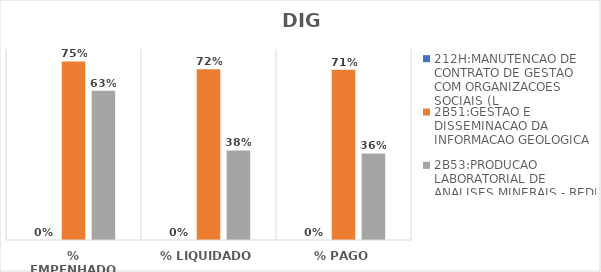
| Category | 212H:MANUTENCAO DE CONTRATO DE GESTAO COM ORGANIZACOES SOCIAIS (L | 2B51:GESTAO E DISSEMINACAO DA INFORMACAO GEOLOGICA | 2B53:PRODUCAO LABORATORIAL DE ANALISES MINERAIS - REDE LAMIN |
|---|---|---|---|
| % EMPENHADO | 0 | 0.748 | 0.625 |
| % LIQUIDADO | 0 | 0.715 | 0.375 |
| % PAGO | 0 | 0.713 | 0.362 |